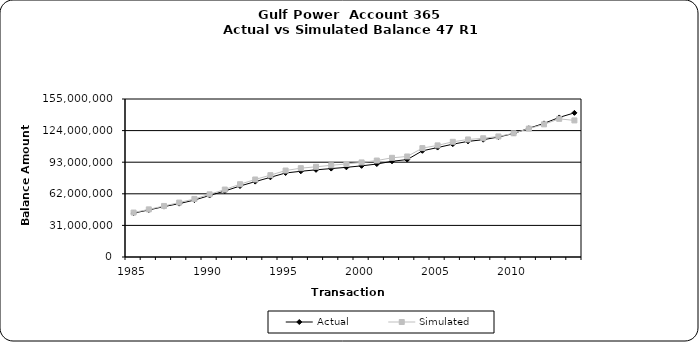
| Category | Actual | Simulated |
|---|---|---|
| 1985.0 | 43053606.34 | 43601597.199 |
| 1986.0 | 46150669.56 | 46709797.975 |
| 1987.0 | 49453774.14 | 50064129.467 |
| 1988.0 | 52361643.17 | 53377875.262 |
| 1989.0 | 55856306.1 | 56966163.604 |
| 1990.0 | 60341210.42 | 61489105.332 |
| 1991.0 | 64713602.42 | 66165936.954 |
| 1992.0 | 69640996.32 | 71411123.036 |
| 1993.0 | 73936547.19 | 76031805.959 |
| 1994.0 | 78153379.86 | 80293603.566 |
| 1995.0 | 82430299.9 | 84820629.081 |
| 1996.0 | 84087541.08 | 87134159.371 |
| 1997.0 | 85507769.08 | 88475504.713 |
| 1998.0 | 86738830.08 | 89961521.226 |
| 1999.0 | 87968289.08 | 91260816.813 |
| 2000.0 | 89414533.08 | 92778259.469 |
| 2001.0 | 91190684.78 | 94636903.254 |
| 2002.0 | 93883257.03 | 97289210.018 |
| 2003.0 | 95574316.73 | 98620758.806 |
| 2004.0 | 104182986.53 | 106819597.379 |
| 2005.0 | 107361370.53 | 109496220.578 |
| 2006.0 | 110697328.53 | 113006055.107 |
| 2007.0 | 113403044.53 | 115307831.729 |
| 2008.0 | 115071323.53 | 116474115.276 |
| 2009.0 | 117679022.78 | 118252792.702 |
| 2010.0 | 121153914.39 | 121347530.392 |
| 2011.0 | 126258110.99 | 125934967.047 |
| 2012.0 | 131065267.26 | 130150825.755 |
| 2013.0 | 136905621.65 | 135544605.56 |
| 2014.0 | 141411299.12 | 133988516.27 |